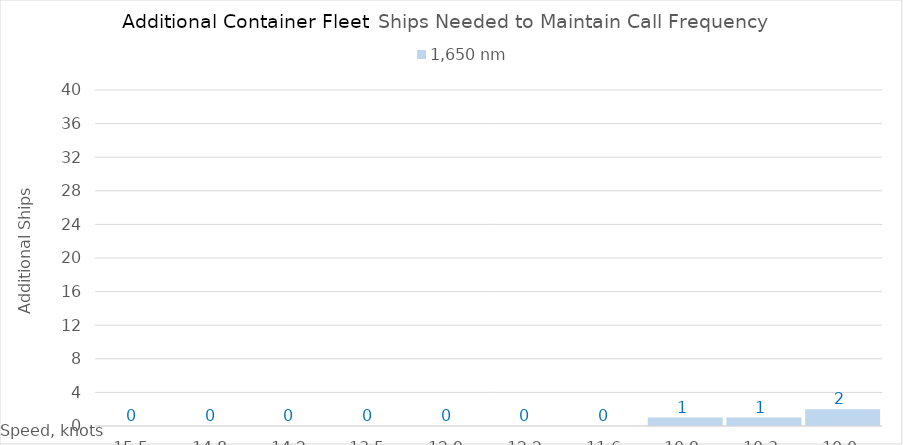
| Category | 1,650 |
|---|---|
| 15.450000000000001 | 0 |
| 14.8 | 0 |
| 14.15 | 0 |
| 13.5 | 0 |
| 12.85 | 0 |
| 12.2 | 0 |
| 11.549999999999999 | 0 |
| 10.899999999999999 | 1 |
| 10.249999999999998 | 1 |
| 10.0 | 2 |